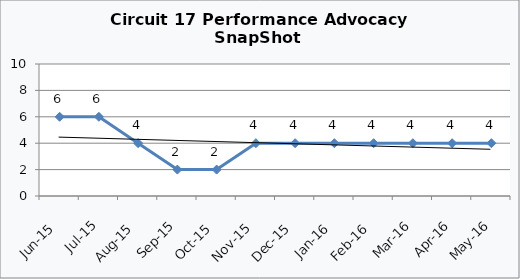
| Category | Circuit 17 |
|---|---|
| Jun-15 | 6 |
| Jul-15 | 6 |
| Aug-15 | 4 |
| Sep-15 | 2 |
| Oct-15 | 2 |
| Nov-15 | 4 |
| Dec-15 | 4 |
| Jan-16 | 4 |
| Feb-16 | 4 |
| Mar-16 | 4 |
| Apr-16 | 4 |
| May-16 | 4 |